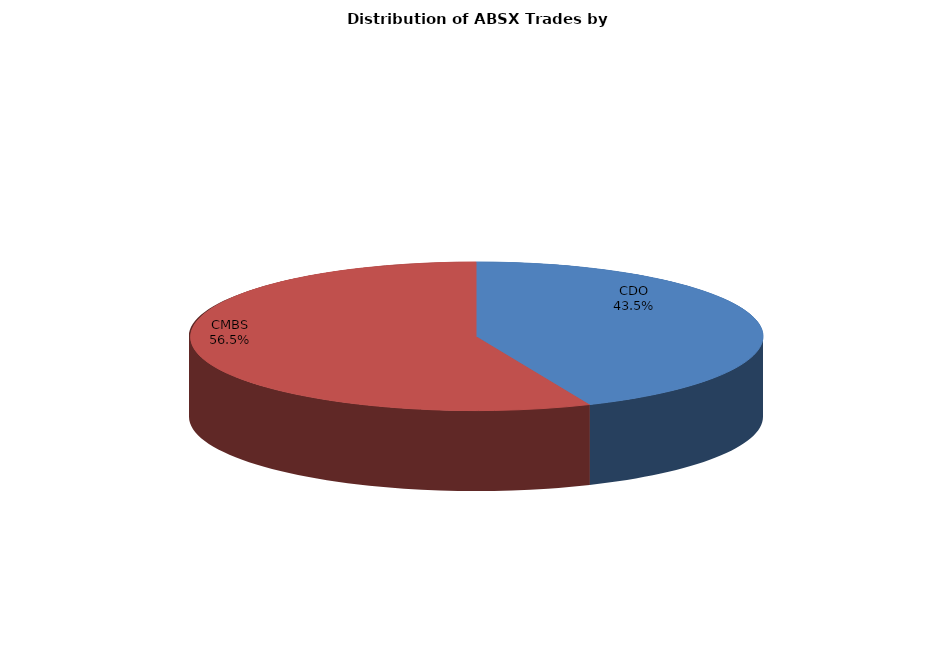
| Category | Series 0 |
|---|---|
| CDO | 178.681 |
| CMBS | 231.841 |